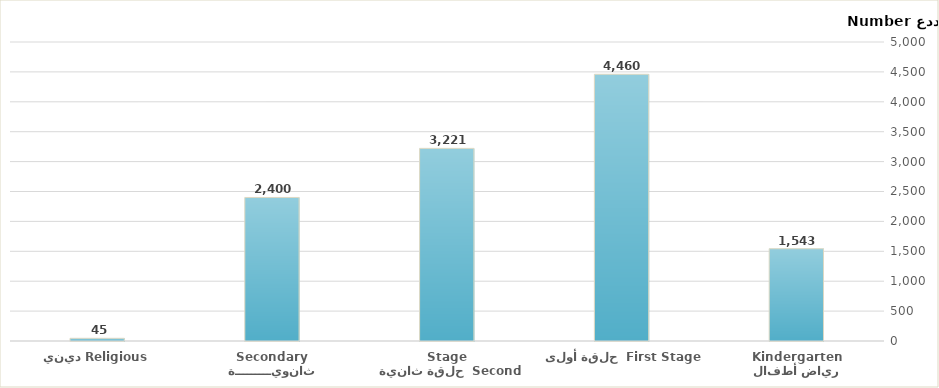
| Category | Series 0 |
|---|---|
| رياض أطفال Kindergarten | 1543 |
|  حلقة أولى  First Stage | 4460 |
|   حلقة ثانية  Second Stage | 3221 |
| ثانويـــــــــة Secondary | 2400 |
| ديني Religious | 45 |